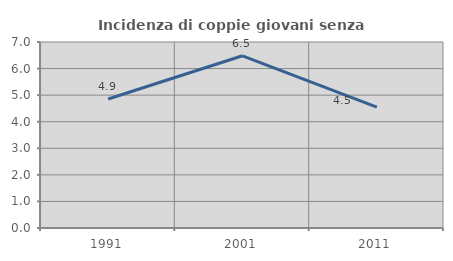
| Category | Incidenza di coppie giovani senza figli |
|---|---|
| 1991.0 | 4.854 |
| 2001.0 | 6.481 |
| 2011.0 | 4.545 |